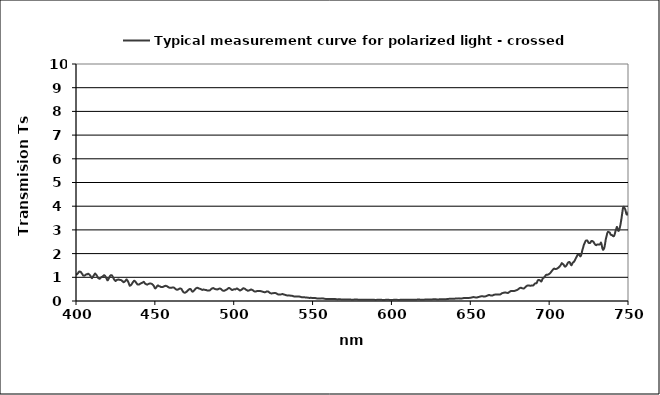
| Category | Typical measurement curve for polarized light - crossed |
|---|---|
| 400.049564 | 1.091 |
| 400.452562 | 1.123 |
| 400.85561 | 1.147 |
| 401.258708 | 1.168 |
| 401.661857 | 1.219 |
| 402.065055 | 1.245 |
| 402.468304 | 1.228 |
| 402.871603 | 1.238 |
| 403.274952 | 1.204 |
| 403.678352 | 1.159 |
| 404.081801 | 1.13 |
| 404.485301 | 1.076 |
| 404.88885 | 1.071 |
| 405.29245 | 1.069 |
| 405.6961 | 1.084 |
| 406.099799 | 1.104 |
| 406.503549 | 1.126 |
| 406.907349 | 1.133 |
| 407.311198 | 1.131 |
| 407.715098 | 1.151 |
| 408.119047 | 1.134 |
| 408.523046 | 1.108 |
| 408.927096 | 1.085 |
| 409.331194 | 1.036 |
| 409.735343 | 0.985 |
| 410.139542 | 0.963 |
| 410.54379 | 1.009 |
| 410.948088 | 1.047 |
| 411.352436 | 1.085 |
| 411.756834 | 1.131 |
| 412.161281 | 1.161 |
| 412.565778 | 1.123 |
| 412.970324 | 1.1 |
| 413.374921 | 1.052 |
| 413.779567 | 1.001 |
| 414.184262 | 0.961 |
| 414.589007 | 0.948 |
| 414.993801 | 0.938 |
| 415.398646 | 0.958 |
| 415.803539 | 0.987 |
| 416.208482 | 1.013 |
| 416.613475 | 1.018 |
| 417.018517 | 1.045 |
| 417.423608 | 1.065 |
| 417.828749 | 1.09 |
| 418.233939 | 1.07 |
| 418.639179 | 1.038 |
| 419.044468 | 0.984 |
| 419.449806 | 0.937 |
| 419.855194 | 0.876 |
| 420.26063 | 0.883 |
| 420.666116 | 0.934 |
| 421.071652 | 0.986 |
| 421.477236 | 1.044 |
| 421.88287 | 1.08 |
| 422.288553 | 1.088 |
| 422.694285 | 1.084 |
| 423.100067 | 1.049 |
| 423.505897 | 0.994 |
| 423.911777 | 0.939 |
| 424.317705 | 0.899 |
| 424.723683 | 0.867 |
| 425.129709 | 0.842 |
| 425.535785 | 0.873 |
| 425.94191 | 0.891 |
| 426.348084 | 0.896 |
| 426.754306 | 0.904 |
| 427.160578 | 0.902 |
| 427.566898 | 0.895 |
| 427.973268 | 0.887 |
| 428.379686 | 0.881 |
| 428.786153 | 0.876 |
| 429.192669 | 0.848 |
| 429.599234 | 0.832 |
| 430.005848 | 0.795 |
| 430.41251 | 0.802 |
| 430.819221 | 0.813 |
| 431.225981 | 0.846 |
| 431.63279 | 0.876 |
| 432.039647 | 0.912 |
| 432.446553 | 0.875 |
| 432.853508 | 0.842 |
| 433.260511 | 0.784 |
| 433.667563 | 0.709 |
| 434.074663 | 0.646 |
| 434.481812 | 0.658 |
| 434.88901 | 0.672 |
| 435.296256 | 0.709 |
| 435.703551 | 0.755 |
| 436.110894 | 0.797 |
| 436.518286 | 0.829 |
| 436.925726 | 0.857 |
| 437.333214 | 0.832 |
| 437.740751 | 0.809 |
| 438.148337 | 0.775 |
| 438.55597 | 0.733 |
| 438.963652 | 0.702 |
| 439.371383 | 0.694 |
| 439.779162 | 0.694 |
| 440.186989 | 0.704 |
| 440.594864 | 0.725 |
| 441.002788 | 0.735 |
| 441.410759 | 0.755 |
| 441.818779 | 0.764 |
| 442.226848 | 0.78 |
| 442.634964 | 0.791 |
| 443.043129 | 0.808 |
| 443.451341 | 0.765 |
| 443.859602 | 0.735 |
| 444.267911 | 0.714 |
| 444.676268 | 0.703 |
| 445.084673 | 0.691 |
| 445.493126 | 0.704 |
| 445.901627 | 0.718 |
| 446.310176 | 0.728 |
| 446.718773 | 0.738 |
| 447.127418 | 0.736 |
| 447.536111 | 0.733 |
| 447.944852 | 0.728 |
| 448.353641 | 0.704 |
| 448.762477 | 0.684 |
| 449.171362 | 0.65 |
| 449.580294 | 0.607 |
| 449.989274 | 0.54 |
| 450.398302 | 0.534 |
| 450.807378 | 0.563 |
| 451.216501 | 0.606 |
| 451.625672 | 0.645 |
| 452.034891 | 0.658 |
| 452.444158 | 0.636 |
| 452.853472 | 0.619 |
| 453.262834 | 0.616 |
| 453.672244 | 0.599 |
| 454.081701 | 0.587 |
| 454.491206 | 0.594 |
| 454.900758 | 0.59 |
| 455.310358 | 0.6 |
| 455.720005 | 0.614 |
| 456.1297 | 0.63 |
| 456.539443 | 0.635 |
| 456.949233 | 0.641 |
| 457.35907 | 0.63 |
| 457.768955 | 0.621 |
| 458.178887 | 0.605 |
| 458.588867 | 0.581 |
| 458.998894 | 0.57 |
| 459.408969 | 0.561 |
| 459.81909 | 0.555 |
| 460.229259 | 0.559 |
| 460.639476 | 0.562 |
| 461.049739 | 0.571 |
| 461.46005 | 0.573 |
| 461.870408 | 0.57 |
| 462.280814 | 0.557 |
| 462.691266 | 0.53 |
| 463.101766 | 0.509 |
| 463.512313 | 0.488 |
| 463.922907 | 0.476 |
| 464.333548 | 0.479 |
| 464.744236 | 0.488 |
| 465.154972 | 0.499 |
| 465.565754 | 0.519 |
| 465.976583 | 0.533 |
| 466.38746 | 0.523 |
| 466.798383 | 0.51 |
| 467.209354 | 0.468 |
| 467.620371 | 0.418 |
| 468.031436 | 0.381 |
| 468.442547 | 0.361 |
| 468.853705 | 0.35 |
| 469.26491 | 0.355 |
| 469.676162 | 0.371 |
| 470.087461 | 0.388 |
| 470.498806 | 0.414 |
| 470.910199 | 0.443 |
| 471.321638 | 0.468 |
| 471.733124 | 0.492 |
| 472.144657 | 0.507 |
| 472.556236 | 0.503 |
| 472.967862 | 0.477 |
| 473.379535 | 0.427 |
| 473.791255 | 0.396 |
| 474.203021 | 0.402 |
| 474.614833 | 0.428 |
| 475.026693 | 0.453 |
| 475.438599 | 0.489 |
| 475.850551 | 0.523 |
| 476.26255 | 0.539 |
| 476.674596 | 0.553 |
| 477.086688 | 0.555 |
| 477.498827 | 0.544 |
| 477.911012 | 0.529 |
| 478.323243 | 0.52 |
| 478.735521 | 0.511 |
| 479.147845 | 0.499 |
| 479.560216 | 0.487 |
| 479.972633 | 0.468 |
| 480.385097 | 0.474 |
| 480.797607 | 0.482 |
| 481.210163 | 0.478 |
| 481.622765 | 0.47 |
| 482.035414 | 0.469 |
| 482.448109 | 0.466 |
| 482.86085 | 0.45 |
| 483.273637 | 0.448 |
| 483.686471 | 0.44 |
| 484.099351 | 0.444 |
| 484.512277 | 0.445 |
| 484.925249 | 0.451 |
| 485.338267 | 0.476 |
| 485.751331 | 0.503 |
| 486.164441 | 0.525 |
| 486.577598 | 0.535 |
| 486.9908 | 0.546 |
| 487.404049 | 0.531 |
| 487.817343 | 0.517 |
| 488.230683 | 0.504 |
| 488.64407 | 0.495 |
| 489.057502 | 0.49 |
| 489.47098 | 0.492 |
| 489.884504 | 0.49 |
| 490.298074 | 0.503 |
| 490.71169 | 0.519 |
| 491.125352 | 0.524 |
| 491.53906 | 0.521 |
| 491.952813 | 0.507 |
| 492.366612 | 0.48 |
| 492.780457 | 0.451 |
| 493.194348 | 0.436 |
| 493.608284 | 0.432 |
| 494.022266 | 0.433 |
| 494.436294 | 0.446 |
| 494.850367 | 0.461 |
| 495.264486 | 0.475 |
| 495.678651 | 0.49 |
| 496.092861 | 0.508 |
| 496.507117 | 0.533 |
| 496.921418 | 0.552 |
| 497.335765 | 0.542 |
| 497.750158 | 0.522 |
| 498.164596 | 0.505 |
| 498.57908 | 0.48 |
| 498.993609 | 0.462 |
| 499.408183 | 0.472 |
| 499.822803 | 0.486 |
| 500.237468 | 0.492 |
| 500.652179 | 0.492 |
| 501.066935 | 0.49 |
| 501.481736 | 0.51 |
| 501.896583 | 0.528 |
| 502.311475 | 0.518 |
| 502.726412 | 0.501 |
| 503.141395 | 0.481 |
| 503.556423 | 0.461 |
| 503.971496 | 0.441 |
| 504.386614 | 0.455 |
| 504.801778 | 0.468 |
| 505.216986 | 0.489 |
| 505.63224 | 0.516 |
| 506.047539 | 0.538 |
| 506.462883 | 0.533 |
| 506.878272 | 0.524 |
| 507.293706 | 0.506 |
| 507.709186 | 0.482 |
| 508.12471 | 0.461 |
| 508.540279 | 0.45 |
| 508.955894 | 0.433 |
| 509.371553 | 0.44 |
| 509.787257 | 0.449 |
| 510.203007 | 0.462 |
| 510.618801 | 0.475 |
| 511.03464 | 0.488 |
| 511.450524 | 0.474 |
| 511.866453 | 0.461 |
| 512.282426 | 0.444 |
| 512.698445 | 0.423 |
| 513.114508 | 0.405 |
| 513.530616 | 0.405 |
| 513.946769 | 0.401 |
| 514.362967 | 0.41 |
| 514.779209 | 0.419 |
| 515.195496 | 0.424 |
| 515.611828 | 0.42 |
| 516.028204 | 0.417 |
| 516.444625 | 0.419 |
| 516.861091 | 0.42 |
| 517.277601 | 0.413 |
| 517.694156 | 0.405 |
| 518.110755 | 0.396 |
| 518.527399 | 0.386 |
| 518.944088 | 0.38 |
| 519.360821 | 0.374 |
| 519.777598 | 0.37 |
| 520.19442 | 0.376 |
| 520.611286 | 0.392 |
| 521.028197 | 0.405 |
| 521.445153 | 0.401 |
| 521.862152 | 0.396 |
| 522.279196 | 0.378 |
| 522.696285 | 0.354 |
| 523.113417 | 0.335 |
| 523.530594 | 0.326 |
| 523.947816 | 0.319 |
| 524.365081 | 0.322 |
| 524.782391 | 0.327 |
| 525.199745 | 0.332 |
| 525.617143 | 0.337 |
| 526.034586 | 0.338 |
| 526.452073 | 0.334 |
| 526.869604 | 0.327 |
| 527.287178 | 0.312 |
| 527.704798 | 0.292 |
| 528.122461 | 0.278 |
| 528.540168 | 0.276 |
| 528.957919 | 0.275 |
| 529.375715 | 0.277 |
| 529.793554 | 0.278 |
| 530.211438 | 0.282 |
| 530.629365 | 0.288 |
| 531.047336 | 0.293 |
| 531.465352 | 0.282 |
| 531.883411 | 0.272 |
| 532.301514 | 0.264 |
| 532.719661 | 0.257 |
| 533.137852 | 0.247 |
| 533.556087 | 0.24 |
| 533.974365 | 0.233 |
| 534.392687 | 0.235 |
| 534.811054 | 0.237 |
| 535.229463 | 0.236 |
| 535.647917 | 0.232 |
| 536.066414 | 0.226 |
| 536.484956 | 0.225 |
| 536.90354 | 0.223 |
| 537.322169 | 0.214 |
| 537.740841 | 0.203 |
| 538.159557 | 0.195 |
| 538.578316 | 0.193 |
| 538.997119 | 0.19 |
| 539.415965 | 0.189 |
| 539.834855 | 0.189 |
| 540.253789 | 0.188 |
| 540.672766 | 0.189 |
| 541.091787 | 0.189 |
| 541.510851 | 0.187 |
| 541.929958 | 0.183 |
| 542.349109 | 0.175 |
| 542.768303 | 0.166 |
| 543.187541 | 0.16 |
| 543.606822 | 0.157 |
| 544.026147 | 0.155 |
| 544.445515 | 0.155 |
| 544.864926 | 0.154 |
| 545.28438 | 0.152 |
| 545.703878 | 0.151 |
| 546.123419 | 0.148 |
| 546.543003 | 0.144 |
| 546.96263 | 0.141 |
| 547.382301 | 0.137 |
| 547.802015 | 0.132 |
| 548.221772 | 0.131 |
| 548.641572 | 0.133 |
| 549.061415 | 0.133 |
| 549.481301 | 0.13 |
| 549.901231 | 0.128 |
| 550.321203 | 0.129 |
| 550.741219 | 0.131 |
| 551.161277 | 0.13 |
| 551.581379 | 0.126 |
| 552.001523 | 0.121 |
| 552.421711 | 0.115 |
| 552.841941 | 0.107 |
| 553.262214 | 0.104 |
| 553.682531 | 0.102 |
| 554.10289 | 0.101 |
| 554.523292 | 0.102 |
| 554.943736 | 0.103 |
| 555.364224 | 0.107 |
| 555.784755 | 0.111 |
| 556.205328 | 0.11 |
| 556.625944 | 0.106 |
| 557.046603 | 0.102 |
| 557.467304 | 0.096 |
| 557.888048 | 0.091 |
| 558.308835 | 0.088 |
| 558.729665 | 0.087 |
| 559.150537 | 0.086 |
| 559.571452 | 0.088 |
| 559.992409 | 0.089 |
| 560.413409 | 0.089 |
| 560.834451 | 0.088 |
| 561.255537 | 0.087 |
| 561.676664 | 0.084 |
| 562.097834 | 0.083 |
| 562.519047 | 0.084 |
| 562.940302 | 0.085 |
| 563.3616 | 0.085 |
| 563.78294 | 0.086 |
| 564.204322 | 0.084 |
| 564.625747 | 0.079 |
| 565.047214 | 0.074 |
| 565.468724 | 0.071 |
| 565.890275 | 0.067 |
| 566.31187 | 0.071 |
| 566.733506 | 0.075 |
| 567.155185 | 0.076 |
| 567.576906 | 0.071 |
| 567.998669 | 0.067 |
| 568.420474 | 0.067 |
| 568.842322 | 0.066 |
| 569.264212 | 0.066 |
| 569.686144 | 0.064 |
| 570.108118 | 0.063 |
| 570.530134 | 0.064 |
| 570.952192 | 0.064 |
| 571.374292 | 0.065 |
| 571.796435 | 0.065 |
| 572.218619 | 0.065 |
| 572.640846 | 0.064 |
| 573.063114 | 0.062 |
| 573.485424 | 0.061 |
| 573.907777 | 0.059 |
| 574.330171 | 0.058 |
| 574.752607 | 0.057 |
| 575.175085 | 0.057 |
| 575.597605 | 0.057 |
| 576.020167 | 0.058 |
| 576.442771 | 0.059 |
| 576.865416 | 0.06 |
| 577.288104 | 0.06 |
| 577.710833 | 0.061 |
| 578.133604 | 0.061 |
| 578.556416 | 0.058 |
| 578.97927 | 0.055 |
| 579.402166 | 0.053 |
| 579.825104 | 0.052 |
| 580.248083 | 0.052 |
| 580.671104 | 0.052 |
| 581.094167 | 0.052 |
| 581.517271 | 0.054 |
| 581.940417 | 0.056 |
| 582.363604 | 0.056 |
| 582.786833 | 0.055 |
| 583.210103 | 0.053 |
| 583.633415 | 0.051 |
| 584.056768 | 0.049 |
| 584.480163 | 0.048 |
| 584.903599 | 0.048 |
| 585.327077 | 0.048 |
| 585.750596 | 0.049 |
| 586.174156 | 0.05 |
| 586.597758 | 0.051 |
| 587.021401 | 0.052 |
| 587.445086 | 0.051 |
| 587.868811 | 0.051 |
| 588.292578 | 0.05 |
| 588.716386 | 0.049 |
| 589.140236 | 0.048 |
| 589.564127 | 0.047 |
| 589.988059 | 0.045 |
| 590.412032 | 0.047 |
| 590.836046 | 0.048 |
| 591.260101 | 0.049 |
| 591.684198 | 0.05 |
| 592.108335 | 0.05 |
| 592.532514 | 0.051 |
| 592.956734 | 0.051 |
| 593.380994 | 0.049 |
| 593.805296 | 0.048 |
| 594.229639 | 0.047 |
| 594.654022 | 0.045 |
| 595.078447 | 0.045 |
| 595.502913 | 0.046 |
| 595.927419 | 0.047 |
| 596.351967 | 0.048 |
| 596.776555 | 0.049 |
| 597.201184 | 0.05 |
| 597.625854 | 0.05 |
| 598.050565 | 0.05 |
| 598.475317 | 0.048 |
| 598.900109 | 0.046 |
| 599.324942 | 0.045 |
| 599.749816 | 0.045 |
| 600.174731 | 0.046 |
| 600.599686 | 0.046 |
| 601.024682 | 0.047 |
| 601.449718 | 0.048 |
| 601.874796 | 0.049 |
| 602.299914 | 0.05 |
| 602.725072 | 0.05 |
| 603.150271 | 0.05 |
| 603.575511 | 0.048 |
| 604.000791 | 0.047 |
| 604.426111 | 0.046 |
| 604.851472 | 0.045 |
| 605.276874 | 0.047 |
| 605.702316 | 0.051 |
| 606.127798 | 0.053 |
| 606.553321 | 0.052 |
| 606.978885 | 0.051 |
| 607.404488 | 0.051 |
| 607.830132 | 0.051 |
| 608.255817 | 0.05 |
| 608.681541 | 0.049 |
| 609.107306 | 0.049 |
| 609.533111 | 0.049 |
| 609.958957 | 0.049 |
| 610.384842 | 0.05 |
| 610.810768 | 0.051 |
| 611.236734 | 0.052 |
| 611.66274 | 0.054 |
| 612.088787 | 0.056 |
| 612.514873 | 0.056 |
| 612.941 | 0.055 |
| 613.367167 | 0.053 |
| 613.793373 | 0.051 |
| 614.21962 | 0.05 |
| 614.645907 | 0.05 |
| 615.072234 | 0.051 |
| 615.498601 | 0.053 |
| 615.925007 | 0.056 |
| 616.351454 | 0.058 |
| 616.777941 | 0.061 |
| 617.204467 | 0.061 |
| 617.631034 | 0.059 |
| 618.05764 | 0.058 |
| 618.484286 | 0.056 |
| 618.910972 | 0.055 |
| 619.337698 | 0.054 |
| 619.764463 | 0.054 |
| 620.191269 | 0.055 |
| 620.618114 | 0.056 |
| 621.044998 | 0.058 |
| 621.471923 | 0.061 |
| 621.898887 | 0.065 |
| 622.325891 | 0.065 |
| 622.752934 | 0.064 |
| 623.180017 | 0.062 |
| 623.60714 | 0.062 |
| 624.034302 | 0.06 |
| 624.461504 | 0.061 |
| 624.888745 | 0.062 |
| 625.316026 | 0.064 |
| 625.743346 | 0.067 |
| 626.170706 | 0.069 |
| 626.598105 | 0.07 |
| 627.025544 | 0.071 |
| 627.453022 | 0.071 |
| 627.880539 | 0.071 |
| 628.308096 | 0.07 |
| 628.735692 | 0.067 |
| 629.163328 | 0.066 |
| 629.591002 | 0.066 |
| 630.018716 | 0.067 |
| 630.44647 | 0.07 |
| 630.874262 | 0.073 |
| 631.302094 | 0.074 |
| 631.729965 | 0.074 |
| 632.157875 | 0.075 |
| 632.585825 | 0.077 |
| 633.013813 | 0.078 |
| 633.441841 | 0.077 |
| 633.869907 | 0.076 |
| 634.298013 | 0.077 |
| 634.726158 | 0.078 |
| 635.154342 | 0.08 |
| 635.582565 | 0.083 |
| 636.010827 | 0.086 |
| 636.439127 | 0.09 |
| 636.867467 | 0.095 |
| 637.295846 | 0.095 |
| 637.724264 | 0.094 |
| 638.15272 | 0.093 |
| 638.581216 | 0.091 |
| 639.00975 | 0.09 |
| 639.438323 | 0.093 |
| 639.866935 | 0.095 |
| 640.295585 | 0.099 |
| 640.724275 | 0.104 |
| 641.153003 | 0.107 |
| 641.58177 | 0.108 |
| 642.010576 | 0.109 |
| 642.43942 | 0.11 |
| 642.868303 | 0.111 |
| 643.297225 | 0.109 |
| 643.726185 | 0.106 |
| 644.155184 | 0.104 |
| 644.584221 | 0.109 |
| 645.013297 | 0.112 |
| 645.442411 | 0.117 |
| 645.871564 | 0.124 |
| 646.300756 | 0.127 |
| 646.729986 | 0.129 |
| 647.159254 | 0.13 |
| 647.588561 | 0.131 |
| 648.017906 | 0.131 |
| 648.44729 | 0.131 |
| 648.876712 | 0.132 |
| 649.306172 | 0.131 |
| 649.735671 | 0.133 |
| 650.165208 | 0.136 |
| 650.594783 | 0.143 |
| 651.024397 | 0.15 |
| 651.454049 | 0.157 |
| 651.883739 | 0.165 |
| 652.313467 | 0.163 |
| 652.743233 | 0.157 |
| 653.173038 | 0.153 |
| 653.60288 | 0.149 |
| 654.032761 | 0.146 |
| 654.46268 | 0.153 |
| 654.892637 | 0.163 |
| 655.322632 | 0.171 |
| 655.752665 | 0.177 |
| 656.182736 | 0.185 |
| 656.612845 | 0.193 |
| 657.042992 | 0.201 |
| 657.473177 | 0.199 |
| 657.9034 | 0.198 |
| 658.333661 | 0.192 |
| 658.763959 | 0.186 |
| 659.194296 | 0.187 |
| 659.62467 | 0.196 |
| 660.055082 | 0.206 |
| 660.485532 | 0.219 |
| 660.91602 | 0.23 |
| 661.346545 | 0.241 |
| 661.777108 | 0.253 |
| 662.207709 | 0.252 |
| 662.638348 | 0.24 |
| 663.069024 | 0.229 |
| 663.499738 | 0.23 |
| 663.930489 | 0.23 |
| 664.361278 | 0.242 |
| 664.792105 | 0.257 |
| 665.222969 | 0.266 |
| 665.653871 | 0.269 |
| 666.084811 | 0.274 |
| 666.515787 | 0.276 |
| 666.946802 | 0.277 |
| 667.377853 | 0.277 |
| 667.808942 | 0.274 |
| 668.240069 | 0.275 |
| 668.671233 | 0.275 |
| 669.102434 | 0.281 |
| 669.533673 | 0.302 |
| 669.964949 | 0.324 |
| 670.396262 | 0.333 |
| 670.827613 | 0.342 |
| 671.259001 | 0.349 |
| 671.690426 | 0.355 |
| 672.121888 | 0.358 |
| 672.553387 | 0.353 |
| 672.984924 | 0.349 |
| 673.416498 | 0.343 |
| 673.848109 | 0.339 |
| 674.279757 | 0.352 |
| 674.711442 | 0.377 |
| 675.143164 | 0.398 |
| 675.574923 | 0.412 |
| 676.006719 | 0.425 |
| 676.438553 | 0.422 |
| 676.870423 | 0.419 |
| 677.30233 | 0.42 |
| 677.734274 | 0.422 |
| 678.166255 | 0.428 |
| 678.598273 | 0.438 |
| 679.030328 | 0.451 |
| 679.462419 | 0.462 |
| 679.894548 | 0.474 |
| 680.326713 | 0.491 |
| 680.758915 | 0.515 |
| 681.191154 | 0.535 |
| 681.623429 | 0.551 |
| 682.055741 | 0.559 |
| 682.48809 | 0.55 |
| 682.920476 | 0.538 |
| 683.352898 | 0.531 |
| 683.785357 | 0.527 |
| 684.217852 | 0.539 |
| 684.650384 | 0.569 |
| 685.082953 | 0.597 |
| 685.515558 | 0.619 |
| 685.9482 | 0.642 |
| 686.380878 | 0.654 |
| 686.813592 | 0.658 |
| 687.246343 | 0.656 |
| 687.679131 | 0.648 |
| 688.111955 | 0.638 |
| 688.544815 | 0.648 |
| 688.977712 | 0.654 |
| 689.410645 | 0.656 |
| 689.843614 | 0.655 |
| 690.276619 | 0.682 |
| 690.709661 | 0.718 |
| 691.142739 | 0.742 |
| 691.575854 | 0.747 |
| 692.009004 | 0.751 |
| 692.442191 | 0.811 |
| 692.875414 | 0.875 |
| 693.308673 | 0.888 |
| 693.741968 | 0.887 |
| 694.175299 | 0.87 |
| 694.608667 | 0.842 |
| 695.04207 | 0.822 |
| 695.475509 | 0.88 |
| 695.908985 | 0.946 |
| 696.342496 | 0.971 |
| 696.776043 | 0.993 |
| 697.209627 | 1.028 |
| 697.643246 | 1.063 |
| 698.076901 | 1.102 |
| 698.510592 | 1.104 |
| 698.944319 | 1.106 |
| 699.378081 | 1.118 |
| 699.81188 | 1.131 |
| 700.245714 | 1.153 |
| 700.679584 | 1.18 |
| 701.11349 | 1.214 |
| 701.547431 | 1.252 |
| 701.981408 | 1.289 |
| 702.415421 | 1.325 |
| 702.84947 | 1.358 |
| 703.283554 | 1.367 |
| 703.717673 | 1.348 |
| 704.151829 | 1.348 |
| 704.58602 | 1.354 |
| 705.020246 | 1.367 |
| 705.454508 | 1.387 |
| 705.888805 | 1.405 |
| 706.323138 | 1.436 |
| 706.757506 | 1.464 |
| 707.19191 | 1.502 |
| 707.626349 | 1.551 |
| 708.060823 | 1.601 |
| 708.495333 | 1.568 |
| 708.929878 | 1.551 |
| 709.364459 | 1.514 |
| 709.799075 | 1.46 |
| 710.233726 | 1.451 |
| 710.668412 | 1.477 |
| 711.103133 | 1.513 |
| 711.53789 | 1.565 |
| 711.972682 | 1.62 |
| 712.407509 | 1.636 |
| 712.842371 | 1.648 |
| 713.277268 | 1.605 |
| 713.712201 | 1.54 |
| 714.147168 | 1.508 |
| 714.58217 | 1.559 |
| 715.017208 | 1.62 |
| 715.45228 | 1.64 |
| 715.887387 | 1.671 |
| 716.32253 | 1.722 |
| 716.757707 | 1.784 |
| 717.192919 | 1.837 |
| 717.628166 | 1.897 |
| 718.063448 | 1.952 |
| 718.498765 | 1.947 |
| 718.934116 | 1.951 |
| 719.369502 | 1.918 |
| 719.804923 | 1.882 |
| 720.240379 | 1.925 |
| 720.67587 | 2.034 |
| 721.111395 | 2.156 |
| 721.546955 | 2.256 |
| 721.982549 | 2.361 |
| 722.418178 | 2.43 |
| 722.853842 | 2.501 |
| 723.28954 | 2.546 |
| 723.725273 | 2.553 |
| 724.16104 | 2.551 |
| 724.596842 | 2.507 |
| 725.032679 | 2.454 |
| 725.468549 | 2.453 |
| 725.904455 | 2.449 |
| 726.340394 | 2.481 |
| 726.776368 | 2.532 |
| 727.212377 | 2.534 |
| 727.648419 | 2.515 |
| 728.084496 | 2.499 |
| 728.520608 | 2.447 |
| 728.956753 | 2.4 |
| 729.392933 | 2.37 |
| 729.829147 | 2.355 |
| 730.265396 | 2.376 |
| 730.701678 | 2.388 |
| 731.137995 | 2.384 |
| 731.574345 | 2.385 |
| 732.01073 | 2.382 |
| 732.447149 | 2.408 |
| 732.883602 | 2.466 |
| 733.320089 | 2.371 |
| 733.75661 | 2.224 |
| 734.193166 | 2.161 |
| 734.629755 | 2.192 |
| 735.066377 | 2.269 |
| 735.503034 | 2.429 |
| 735.939725 | 2.611 |
| 736.37645 | 2.728 |
| 736.813208 | 2.85 |
| 737.250001 | 2.916 |
| 737.686827 | 2.908 |
| 738.123687 | 2.902 |
| 738.56058 | 2.87 |
| 738.997508 | 2.803 |
| 739.434469 | 2.786 |
| 739.871464 | 2.782 |
| 740.308492 | 2.75 |
| 740.745554 | 2.731 |
| 741.18265 | 2.747 |
| 741.619779 | 2.831 |
| 742.056942 | 2.945 |
| 742.494138 | 3.032 |
| 742.931368 | 3.127 |
| 743.368632 | 3.054 |
| 743.805928 | 2.966 |
| 744.243259 | 2.973 |
| 744.680622 | 3.066 |
| 745.11802 | 3.186 |
| 745.55545 | 3.352 |
| 745.992914 | 3.539 |
| 746.430411 | 3.747 |
| 746.867942 | 3.936 |
| 747.305505 | 3.979 |
| 747.743102 | 3.927 |
| 748.180732 | 3.876 |
| 748.618396 | 3.769 |
| 749.056092 | 3.661 |
| 749.493822 | 3.646 |
| 749.931585 | 3.647 |
| 750.369381 | 3.774 |